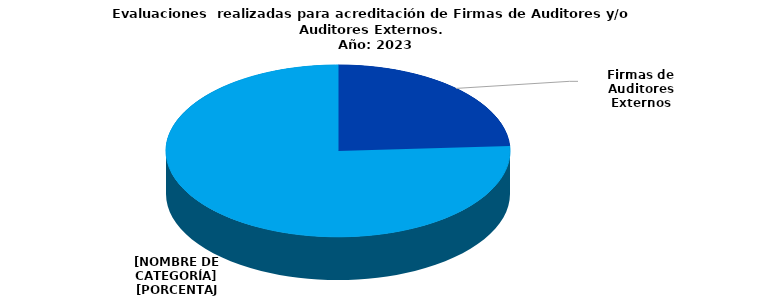
| Category | Series 0 |
|---|---|
| Firmas de Auditores Externos | 13 |
| Auditores Externos | 41 |